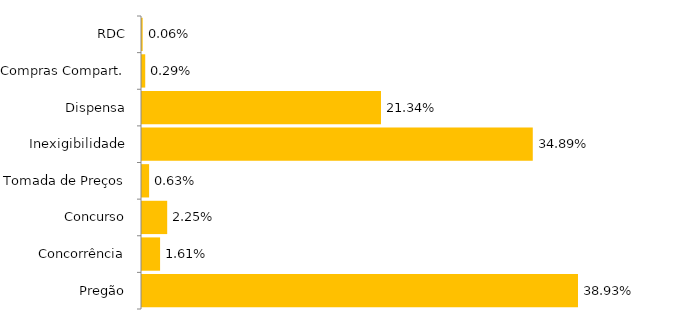
| Category | Series 0 |
|---|---|
| Pregão | 0.389 |
| Concorrência | 0.016 |
| Concurso | 0.022 |
| Tomada de Preços | 0.006 |
| Inexigibilidade | 0.349 |
| Dispensa | 0.213 |
| Compras Compart. | 0.003 |
| RDC | 0.001 |